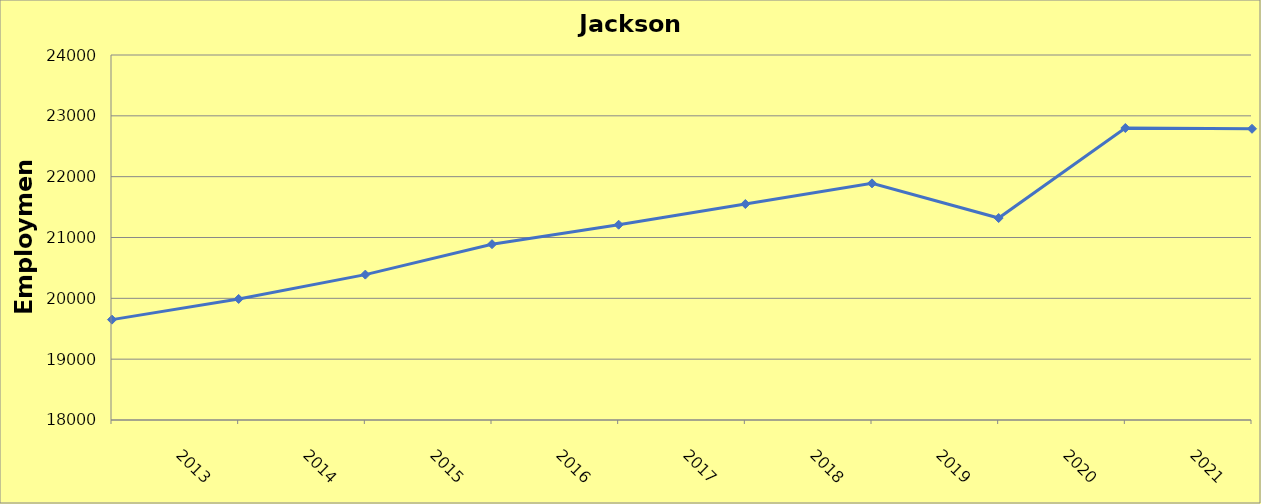
| Category | Jackson County |
|---|---|
| 2013.0 | 19650 |
| 2014.0 | 19990 |
| 2015.0 | 20390 |
| 2016.0 | 20890 |
| 2017.0 | 21210 |
| 2018.0 | 21550 |
| 2019.0 | 21890 |
| 2020.0 | 21320 |
| 2021.0 | 22800 |
| 2022.0 | 22787 |